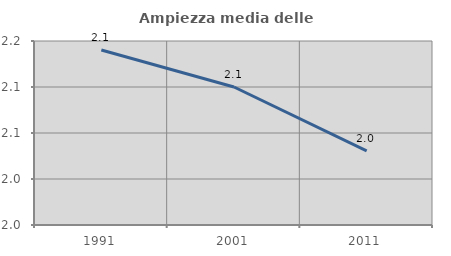
| Category | Ampiezza media delle famiglie |
|---|---|
| 1991.0 | 2.14 |
| 2001.0 | 2.1 |
| 2011.0 | 2.031 |